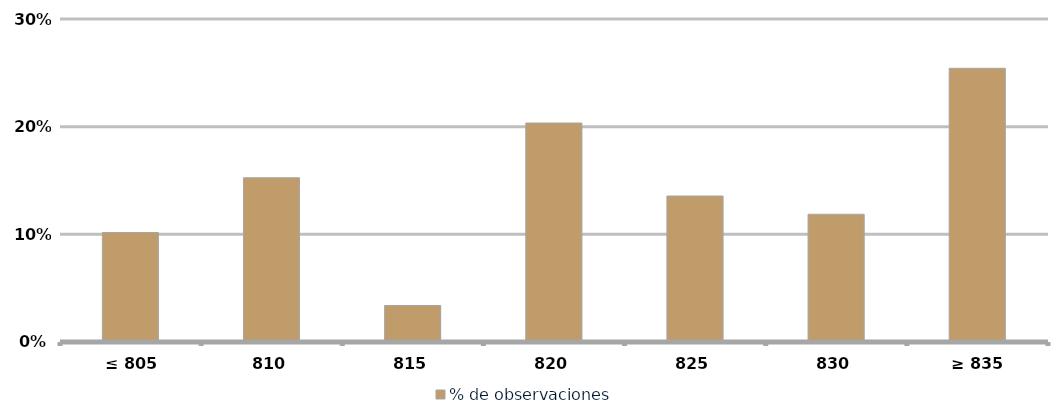
| Category | % de observaciones  |
|---|---|
|  ≤ 805  | 0.102 |
|  810  | 0.153 |
|  815  | 0.034 |
|  820  | 0.203 |
|  825  | 0.136 |
| 830 | 0.119 |
|  ≥ 835  | 0.254 |